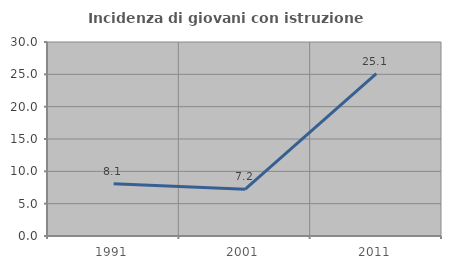
| Category | Incidenza di giovani con istruzione universitaria |
|---|---|
| 1991.0 | 8.092 |
| 2001.0 | 7.216 |
| 2011.0 | 25.118 |